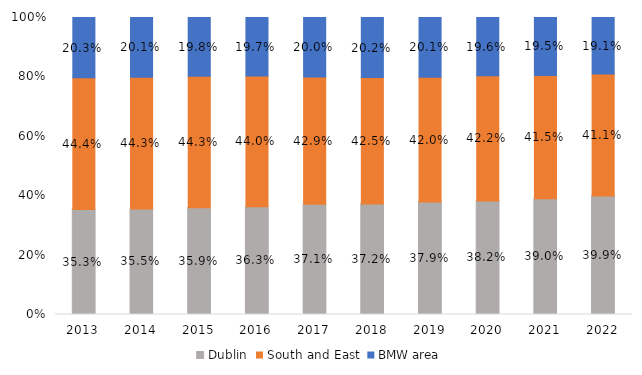
| Category | Dublin | South and East | BMW area |
|---|---|---|---|
| 2013.0 | 0.353 | 0.444 | 0.203 |
| 2014.0 | 0.355 | 0.443 | 0.201 |
| 2015.0 | 0.359 | 0.443 | 0.198 |
| 2016.0 | 0.363 | 0.44 | 0.197 |
| 2017.0 | 0.371 | 0.429 | 0.2 |
| 2018.0 | 0.372 | 0.425 | 0.202 |
| 2019.0 | 0.379 | 0.42 | 0.201 |
| 2020.0 | 0.382 | 0.422 | 0.196 |
| 2021.0 | 0.39 | 0.415 | 0.195 |
| 2022.0 | 0.399 | 0.411 | 0.191 |